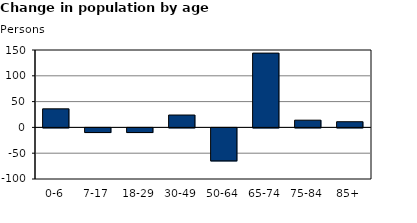
| Category | Series 2 |
|---|---|
| 0-6 | 36 |
| 7-17 | -9 |
| 18-29 | -9 |
| 30-49 | 24 |
| 50-64 | -64 |
| 65-74 | 144 |
| 75-84 | 14 |
| 85+ | 11 |